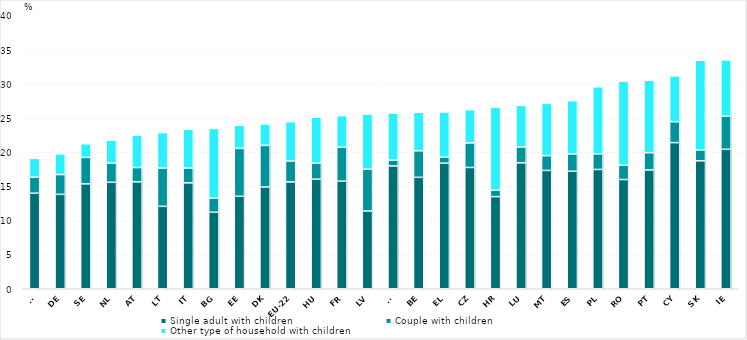
| Category | Single adult with children  | Couple with children  | Other type of household with children  |
|---|---|---|---|
| FI | 13.999 | 2.349 | 2.759 |
| DE | 13.829 | 2.9 | 3.044 |
| SE | 15.368 | 3.878 | 1.995 |
| NL | 15.598 | 2.801 | 3.379 |
| AT | 15.672 | 2.084 | 4.735 |
| LT | 12.075 | 5.597 | 5.21 |
| IT | 15.517 | 2.172 | 5.677 |
| BG | 11.211 | 2.058 | 10.226 |
| EE | 13.548 | 7.016 | 3.391 |
| DK | 14.908 | 6.096 | 3.154 |
| EU-22 | 15.659 | 3.069 | 5.752 |
| HU | 16.053 | 2.36 | 6.722 |
| FR | 15.761 | 4.967 | 4.643 |
| LV | 11.39 | 6.127 | 8.085 |
| SI | 17.991 | 0.85 | 6.907 |
| BE | 16.324 | 3.893 | 5.636 |
| EL | 18.4 | 0.866 | 6.645 |
| CZ | 17.77 | 3.6 | 4.868 |
| HR | 13.499 | 0.938 | 12.164 |
| LU | 18.452 | 2.33 | 6.088 |
| MT | 17.338 | 2.161 | 7.662 |
| ES | 17.22 | 2.54 | 7.791 |
| PL | 17.479 | 2.295 | 9.817 |
| RO | 16.005 | 2.126 | 12.264 |
| PT | 17.404 | 2.527 | 10.627 |
| CY | 21.414 | 3.055 | 6.721 |
| SK | 18.741 | 1.598 | 13.136 |
| IE | 20.434 | 4.837 | 8.253 |